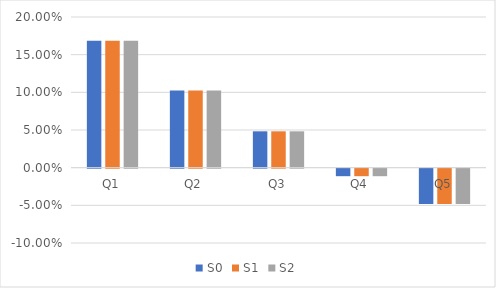
| Category | S0 | S1 | S2 |
|---|---|---|---|
| Q1 | 0.169 | 0.169 | 0.169 |
| Q2 | 0.103 | 0.103 | 0.103 |
| Q3 | 0.048 | 0.048 | 0.048 |
| Q4 | -0.01 | -0.01 | -0.01 |
| Q5 | -0.047 | -0.047 | -0.047 |